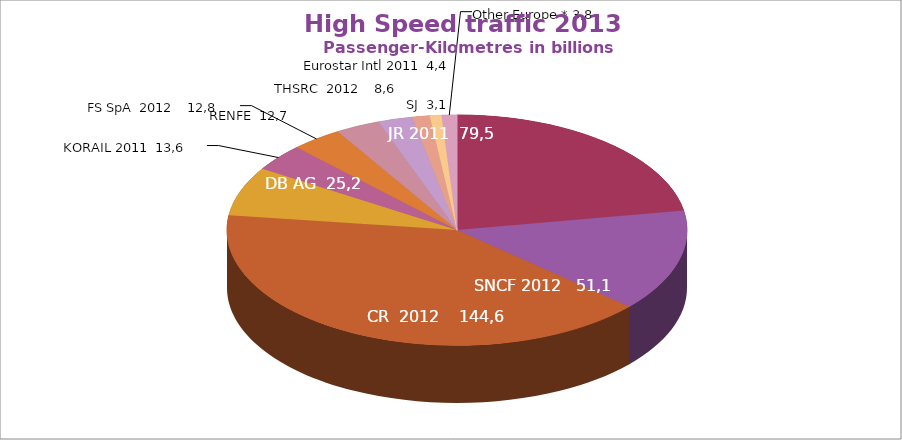
| Category | Series 0 |
|---|---|
| JR 2011 | 79.532 |
| SNCF | 51.086 |
| CR 2012 | 144.606 |
| DB AG | 24.649 |
| KORAIL 2011 | 13.561 |
| FS SpA | 12.794 |
| RENFE | 11.177 |
| THSRC  | 8.641 |
| Eurostar Intl 2011 | 4.364 |
| SJ | 2.948 |
| Other Europe (CD, CP, NS, SNCB 2011, SZ, TCDD, VR) | 3.824 |